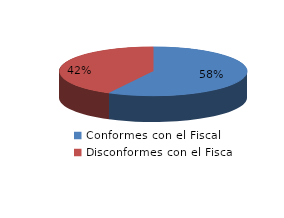
| Category | Series 0 |
|---|---|
| 0 | 56 |
| 1 | 41 |